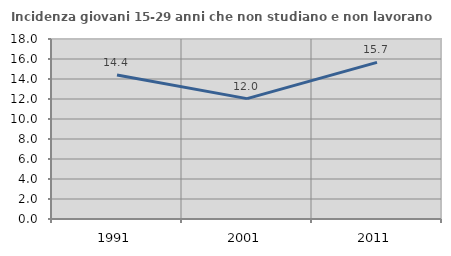
| Category | Incidenza giovani 15-29 anni che non studiano e non lavorano  |
|---|---|
| 1991.0 | 14.407 |
| 2001.0 | 12.037 |
| 2011.0 | 15.663 |